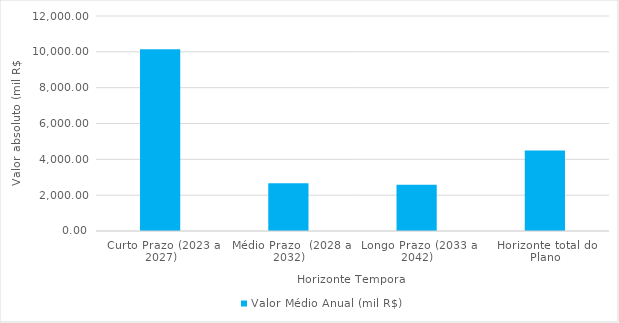
| Category | Valor Médio Anual (mil R$) |
|---|---|
| Curto Prazo (2023 a 2027) | 10147.053 |
| Médio Prazo  (2028 a 2032) | 2659.754 |
| Longo Prazo (2033 a 2042) | 2584.478 |
| Horizonte total do Plano | 4493.941 |